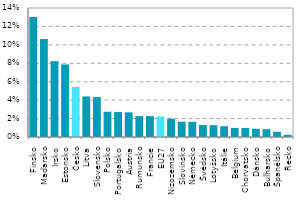
| Category | Series 0 |
|---|---|
| Finsko | 0.13 |
| Maďarsko | 0.106 |
| Irsko | 0.082 |
| Estonsko | 0.079 |
| Česko | 0.054 |
| Litva | 0.044 |
| Slovensko | 0.043 |
| Polsko | 0.027 |
| Portugalsko | 0.027 |
| Austria | 0.027 |
| Rumunsko | 0.023 |
| Francie | 0.023 |
| EU27 | 0.022 |
| Nizozemsko | 0.02 |
| Slovinsko | 0.017 |
| Německo | 0.016 |
| Švédsko | 0.013 |
| Lotyšsko | 0.013 |
| Itálie | 0.012 |
| Belgium | 0.01 |
| Chorvatsko | 0.01 |
| Dánsko | 0.009 |
| Bulharsko | 0.008 |
| Španělsko | 0.006 |
| Řecko | 0.002 |